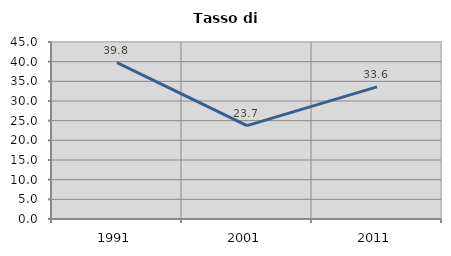
| Category | Tasso di disoccupazione   |
|---|---|
| 1991.0 | 39.77 |
| 2001.0 | 23.725 |
| 2011.0 | 33.592 |